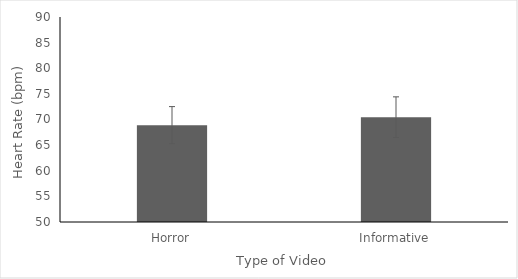
| Category | Series 0 |
|---|---|
| Horror | 68.889 |
| Informative | 70.444 |